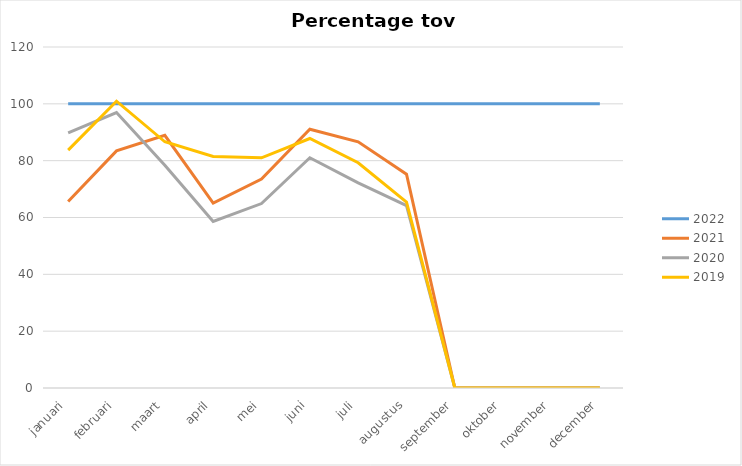
| Category | 2022 | 2021 | 2020 | 2019 |
|---|---|---|---|---|
| januari | 100 | 65.617 | 89.764 | 83.727 |
| februari | 100 | 83.436 | 96.933 | 100.92 |
| maart | 100 | 88.92 | 78.409 | 86.648 |
| april | 100 | 65.039 | 58.612 | 81.491 |
| mei | 100 | 73.558 | 64.904 | 81.01 |
| juni | 100 | 91.057 | 81.03 | 87.805 |
| juli | 100 | 86.648 | 72.159 | 79.261 |
| augustus | 100 | 75.245 | 64.216 | 65.441 |
| september | 100 | 0 | 0 | 0 |
| oktober | 100 | 0 | 0 | 0 |
| november | 100 | 0 | 0 | 0 |
| december | 100 | 0 | 0 | 0 |